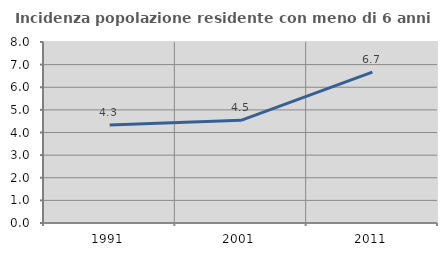
| Category | Incidenza popolazione residente con meno di 6 anni |
|---|---|
| 1991.0 | 4.334 |
| 2001.0 | 4.537 |
| 2011.0 | 6.667 |